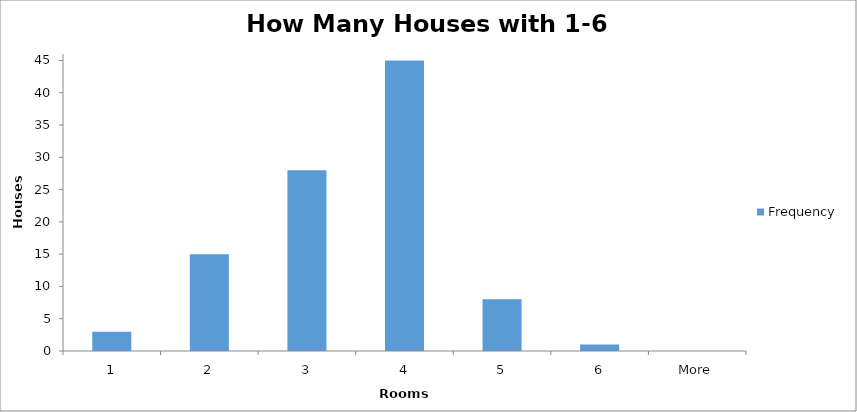
| Category | Frequency |
|---|---|
| 1 | 3 |
| 2 | 15 |
| 3 | 28 |
| 4 | 45 |
| 5 | 8 |
| 6 | 1 |
| More | 0 |